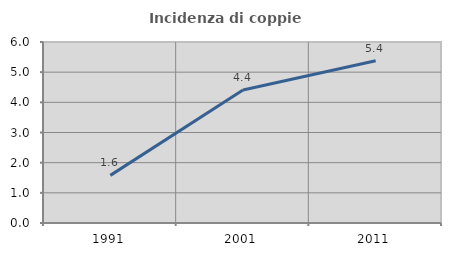
| Category | Incidenza di coppie miste |
|---|---|
| 1991.0 | 1.579 |
| 2001.0 | 4.412 |
| 2011.0 | 5.381 |